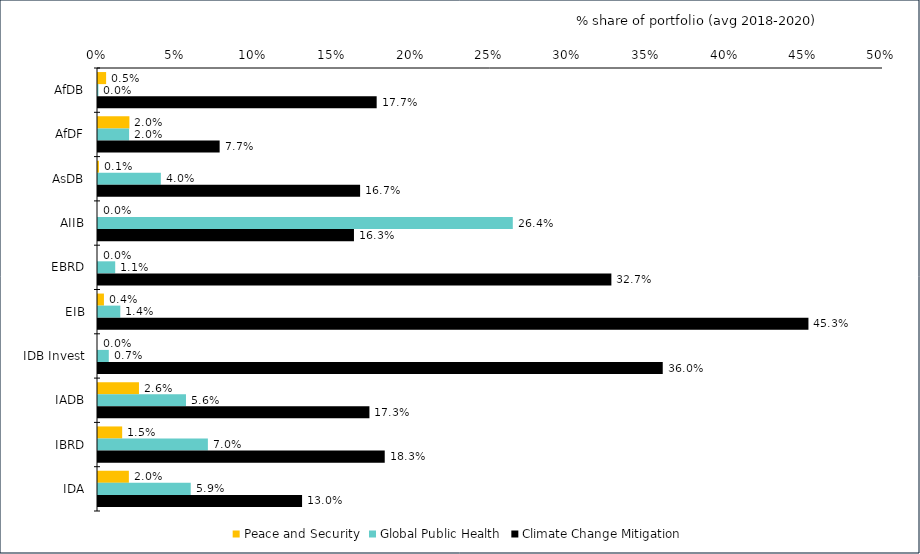
| Category | Peace and Security | Global Public Health | Climate Change Mitigation |
|---|---|---|---|
| AfDB | 0.005 | 0 | 0.177 |
| AfDF | 0.02 | 0.02 | 0.077 |
| AsDB | 0.001 | 0.04 | 0.167 |
| AIIB | 0 | 0.264 | 0.163 |
| EBRD | 0 | 0.011 | 0.327 |
| EIB | 0.004 | 0.014 | 0.453 |
| IDB Invest | 0 | 0.007 | 0.36 |
| IADB | 0.026 | 0.056 | 0.173 |
| IBRD | 0.015 | 0.07 | 0.183 |
| IDA | 0.02 | 0.059 | 0.13 |